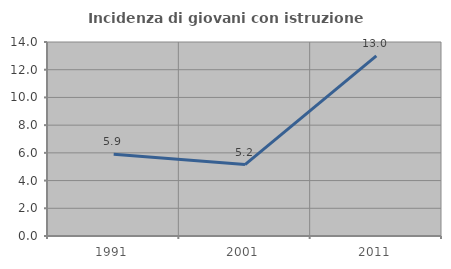
| Category | Incidenza di giovani con istruzione universitaria |
|---|---|
| 1991.0 | 5.906 |
| 2001.0 | 5.155 |
| 2011.0 | 13.004 |